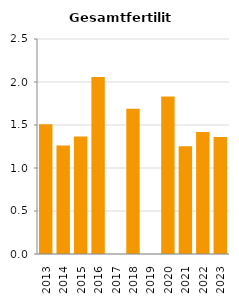
| Category | Gesamtfertilität |
|---|---|
| 2013.0 | 1.51 |
| 2014.0 | 1.262 |
| 2015.0 | 1.366 |
| 2016.0 | 2.059 |
| 2017.0 | 0 |
| 2018.0 | 1.69 |
| 2019.0 | 0 |
| 2020.0 | 1.83 |
| 2021.0 | 1.253 |
| 2022.0 | 1.42 |
| 2023.0 | 1.361 |